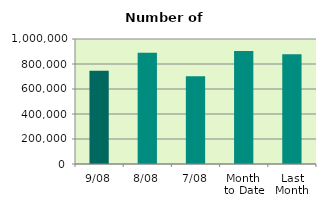
| Category | Series 0 |
|---|---|
| 9/08 | 746302 |
| 8/08 | 889562 |
| 7/08 | 701624 |
| Month 
to Date | 904196.571 |
| Last
Month | 877151.619 |